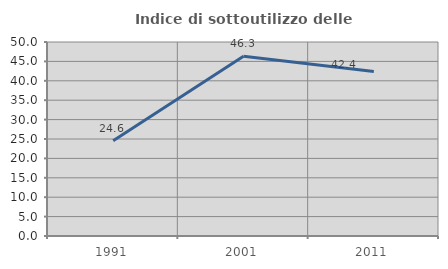
| Category | Indice di sottoutilizzo delle abitazioni  |
|---|---|
| 1991.0 | 24.561 |
| 2001.0 | 46.324 |
| 2011.0 | 42.384 |